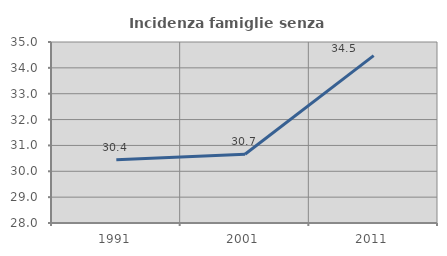
| Category | Incidenza famiglie senza nuclei |
|---|---|
| 1991.0 | 30.442 |
| 2001.0 | 30.661 |
| 2011.0 | 34.473 |